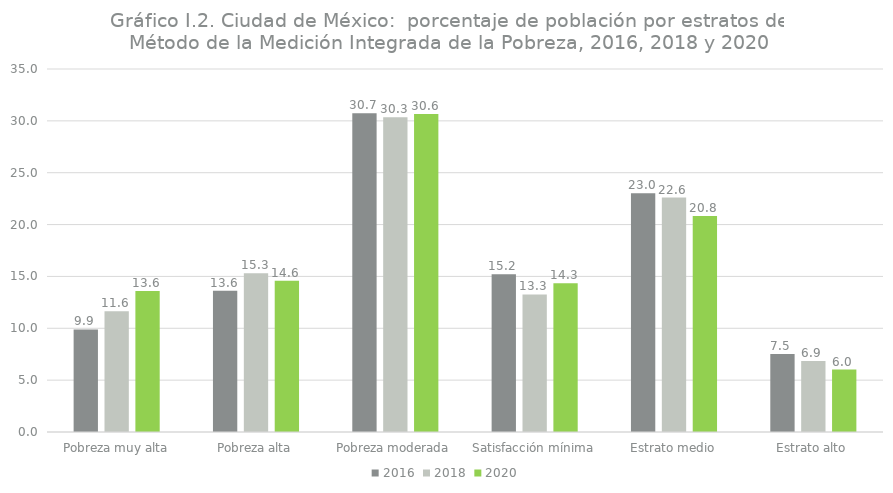
| Category | 2016 | 2018 | 2020 |
|---|---|---|---|
| Pobreza muy alta | 9.886 | 11.644 | 13.591 |
| Pobreza alta | 13.617 | 15.295 | 14.588 |
| Pobreza moderada | 30.737 | 30.339 | 30.649 |
| Satisfacción mínima | 15.207 | 13.262 | 14.334 |
| Estrato medio | 23.027 | 22.604 | 20.818 |
| Estrato alto | 7.526 | 6.855 | 6.02 |